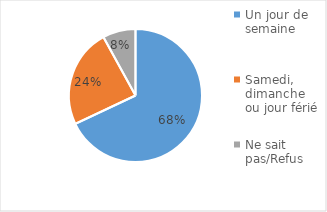
| Category | Series 0 |
|---|---|
| Un jour de semaine | 0.68 |
| Samedi, dimanche ou jour férié | 0.24 |
| Ne sait pas/Refus | 0.08 |